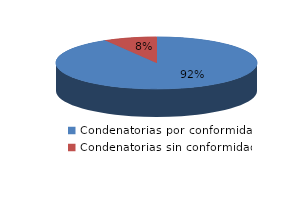
| Category | Series 0 |
|---|---|
| 0 | 905 |
| 1 | 84 |